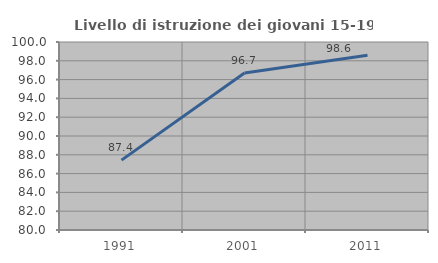
| Category | Livello di istruzione dei giovani 15-19 anni |
|---|---|
| 1991.0 | 87.433 |
| 2001.0 | 96.707 |
| 2011.0 | 98.587 |